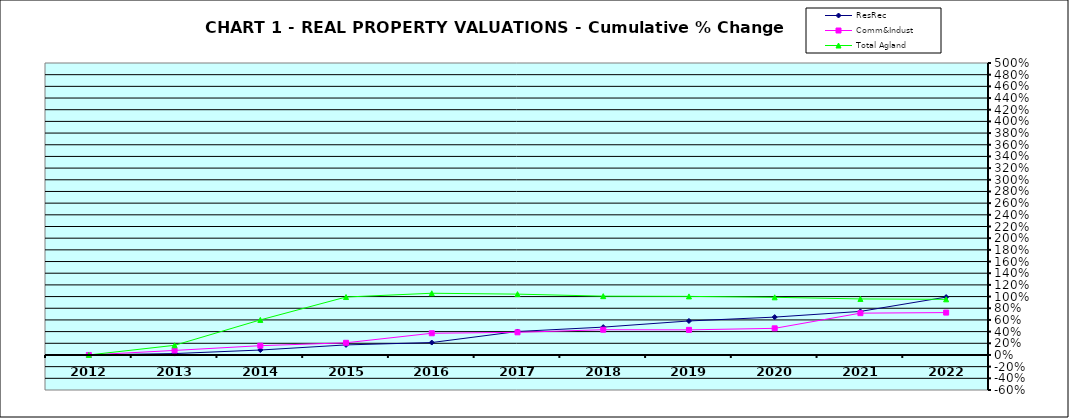
| Category | ResRec | Comm&Indust | Total Agland |
|---|---|---|---|
| 2012.0 | 0 | 0 | 0 |
| 2013.0 | 0.024 | 0.078 | 0.165 |
| 2014.0 | 0.085 | 0.159 | 0.601 |
| 2015.0 | 0.172 | 0.209 | 0.992 |
| 2016.0 | 0.213 | 0.372 | 1.057 |
| 2017.0 | 0.402 | 0.388 | 1.042 |
| 2018.0 | 0.477 | 0.432 | 1.007 |
| 2019.0 | 0.582 | 0.43 | 1.003 |
| 2020.0 | 0.648 | 0.456 | 0.988 |
| 2021.0 | 0.746 | 0.716 | 0.959 |
| 2022.0 | 0.991 | 0.726 | 0.953 |